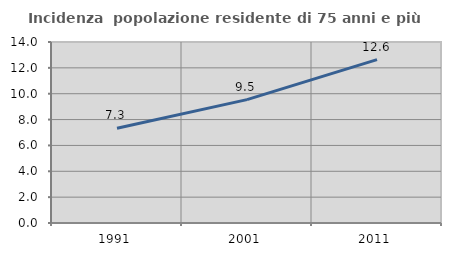
| Category | Incidenza  popolazione residente di 75 anni e più |
|---|---|
| 1991.0 | 7.328 |
| 2001.0 | 9.544 |
| 2011.0 | 12.632 |